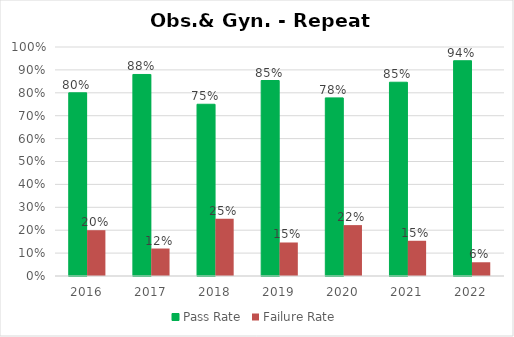
| Category | Pass Rate | Failure Rate |
|---|---|---|
| 2016.0 | 0.8 | 0.2 |
| 2017.0 | 0.88 | 0.12 |
| 2018.0 | 0.75 | 0.25 |
| 2019.0 | 0.854 | 0.146 |
| 2020.0 | 0.778 | 0.222 |
| 2021.0 | 0.846 | 0.154 |
| 2022.0 | 0.94 | 0.06 |